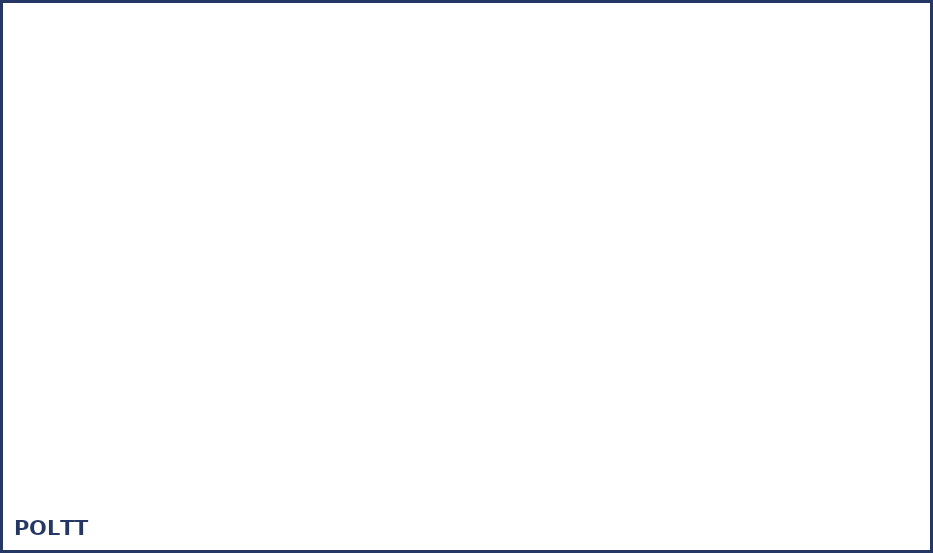
| Category | Series 0 |
|---|---|
| Polttopuu  | 0 |
| Nestekaasu  | 0 |
| Diesel  | 0 |
| Polttoöljy, valopetroli ym.  | 0 |